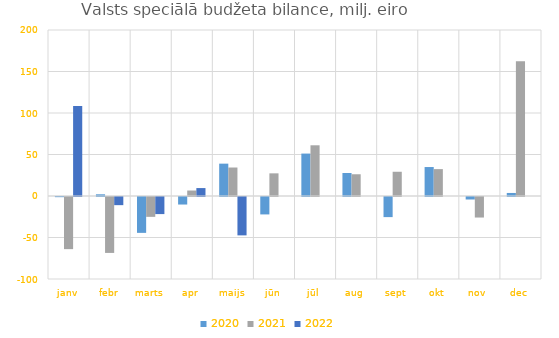
| Category | 2020 | 2021 | 2022 |
|---|---|---|---|
| janv | -199.839 | -62808.075 | 108554.179 |
| febr | 2049.427 | -67375.438 | -9818.538 |
| marts | -43219.176 | -23930.666 | -20590.078 |
| apr | -9074.401 | 6610.878 | 9551.101 |
| maijs | 38978.317 | 34323.187 | -46228.723 |
| jūn | -20988.328 | 27288.039 | 0 |
| jūl | 51118.587 | 61101.998 | 0 |
| aug | 27698.363 | 26197.43 | 0 |
| sept | -24231.793 | 29202.435 | 0 |
| okt | 34894.946 | 32397.037 | 0 |
| nov | -3008.189 | -24738.863 | 0 |
| dec | 3652.649 | 162256.524 | 0 |